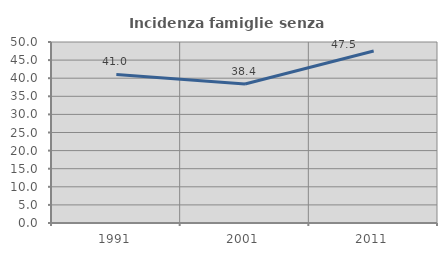
| Category | Incidenza famiglie senza nuclei |
|---|---|
| 1991.0 | 41.032 |
| 2001.0 | 38.416 |
| 2011.0 | 47.507 |